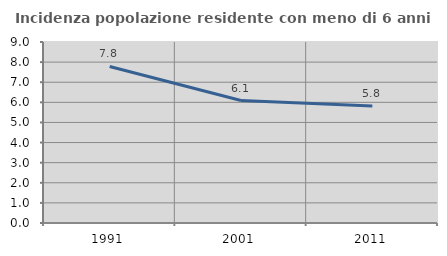
| Category | Incidenza popolazione residente con meno di 6 anni |
|---|---|
| 1991.0 | 7.785 |
| 2001.0 | 6.088 |
| 2011.0 | 5.817 |